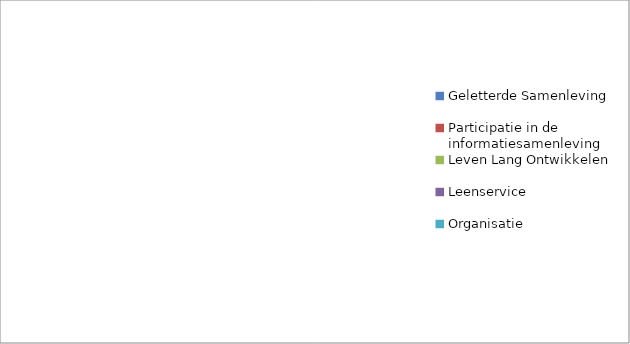
| Category | Series 0 |
|---|---|
| Geletterde Samenleving | 0 |
| Participatie in de informatiesamenleving | 0 |
| Leven Lang Ontwikkelen | 0 |
| Leenservice | 0 |
| Organisatie | 0 |